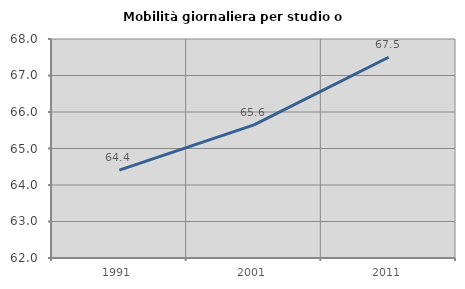
| Category | Mobilità giornaliera per studio o lavoro |
|---|---|
| 1991.0 | 64.409 |
| 2001.0 | 65.649 |
| 2011.0 | 67.5 |